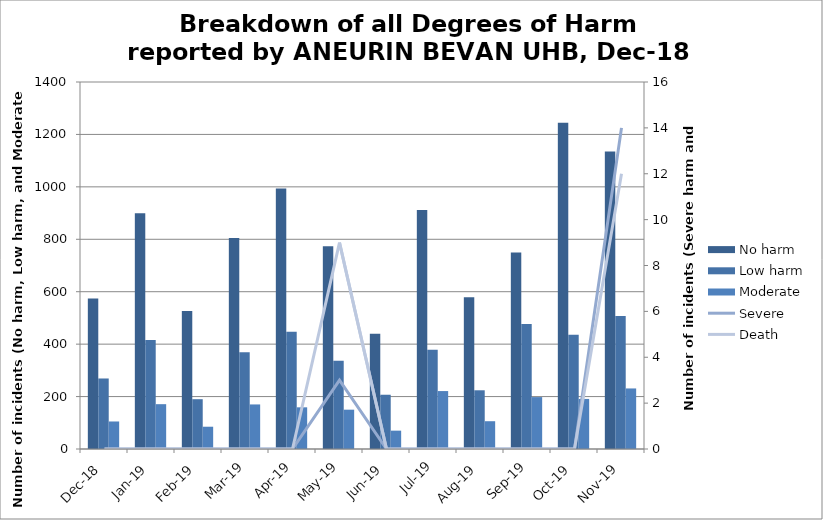
| Category | No harm | Low harm | Moderate |
|---|---|---|---|
| Dec-18 | 574 | 269 | 105 |
| Jan-19 | 899 | 416 | 171 |
| Feb-19 | 526 | 190 | 85 |
| Mar-19 | 805 | 369 | 170 |
| Apr-19 | 994 | 447 | 159 |
| May-19 | 773 | 337 | 150 |
| Jun-19 | 440 | 207 | 70 |
| Jul-19 | 912 | 379 | 221 |
| Aug-19 | 579 | 224 | 106 |
| Sep-19 | 750 | 477 | 198 |
| Oct-19 | 1245 | 436 | 191 |
| Nov-19 | 1135 | 507 | 231 |